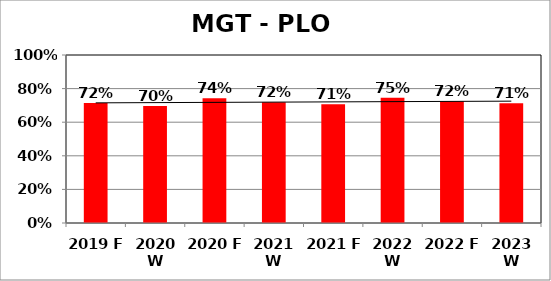
| Category | Series 0 |
|---|---|
| 2019 F | 0.715 |
| 2020 W | 0.696 |
| 2020 F | 0.743 |
| 2021 W | 0.718 |
| 2021 F | 0.707 |
| 2022 W | 0.745 |
| 2022 F | 0.724 |
| 2023 W | 0.713 |